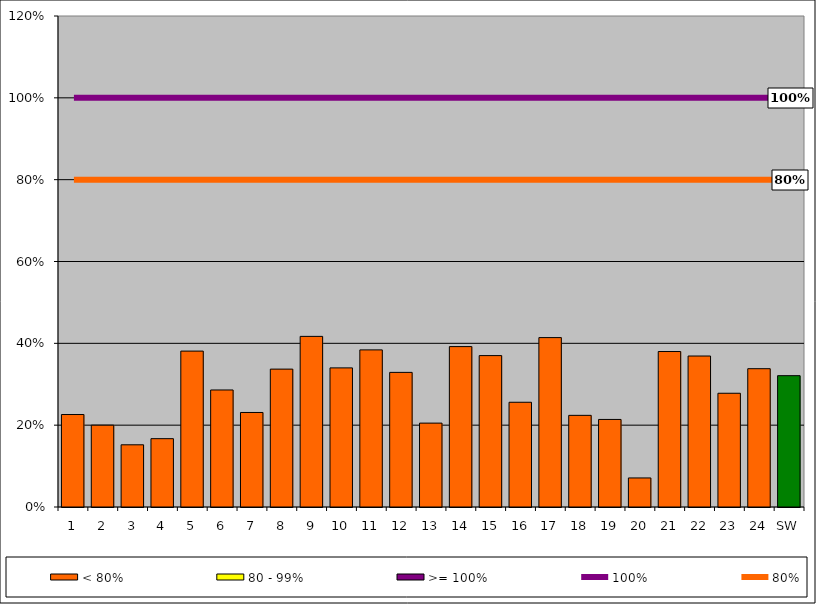
| Category | < 80% | 80 - 99% | >= 100% |
|---|---|---|---|
| 1 | 0.226 | 0 | 0 |
| 2 | 0.2 | 0 | 0 |
| 3 | 0.152 | 0 | 0 |
| 4 | 0.167 | 0 | 0 |
| 5 | 0.381 | 0 | 0 |
| 6 | 0.286 | 0 | 0 |
| 7 | 0.231 | 0 | 0 |
| 8 | 0.337 | 0 | 0 |
| 9 | 0.417 | 0 | 0 |
| 10 | 0.34 | 0 | 0 |
| 11 | 0.384 | 0 | 0 |
| 12 | 0.329 | 0 | 0 |
| 13 | 0.205 | 0 | 0 |
| 14 | 0.392 | 0 | 0 |
| 15 | 0.37 | 0 | 0 |
| 16 | 0.256 | 0 | 0 |
| 17 | 0.414 | 0 | 0 |
| 18 | 0.224 | 0 | 0 |
| 19 | 0.214 | 0 | 0 |
| 20 | 0.071 | 0 | 0 |
| 21 | 0.38 | 0 | 0 |
| 22 | 0.369 | 0 | 0 |
| 23 | 0.278 | 0 | 0 |
| 24 | 0.338 | 0 | 0 |
| SW | 0.321 | 0 | 0 |